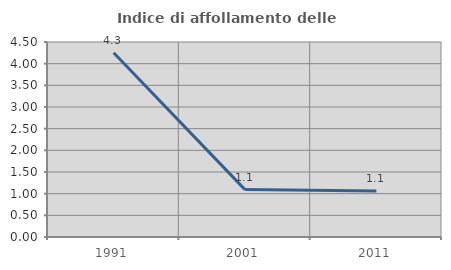
| Category | Indice di affollamento delle abitazioni  |
|---|---|
| 1991.0 | 4.25 |
| 2001.0 | 1.094 |
| 2011.0 | 1.064 |